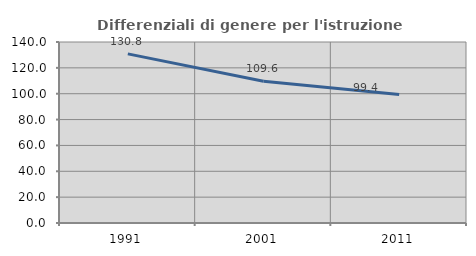
| Category | Differenziali di genere per l'istruzione superiore |
|---|---|
| 1991.0 | 130.819 |
| 2001.0 | 109.646 |
| 2011.0 | 99.414 |